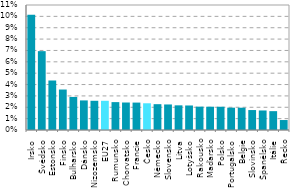
| Category | Series 0 |
|---|---|
| Irsko | 0.101 |
| Švédsko | 0.069 |
| Estonsko | 0.044 |
| Finsko | 0.036 |
| Bulharsko | 0.029 |
| Dánsko | 0.026 |
| Nizozemsko | 0.026 |
| EU27 | 0.026 |
| Rumunsko | 0.025 |
| Chorvatsko | 0.024 |
| Francie | 0.024 |
| Česko | 0.024 |
| Německo | 0.023 |
| Slovensko | 0.022 |
| Litva | 0.022 |
| Lotyšsko | 0.022 |
| Rakousko | 0.021 |
| Maďarsko | 0.02 |
| Polsko | 0.02 |
| Portugalsko | 0.02 |
| Belgie | 0.02 |
| Slovinsko | 0.018 |
| Španělsko | 0.017 |
| Itálie | 0.017 |
| Řecko | 0.009 |